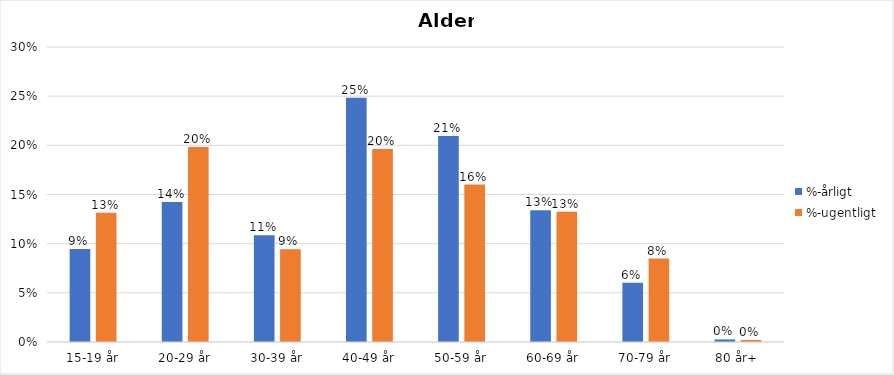
| Category | %-årligt | %-ugentligt |
|---|---|---|
| 15-19 år | 0.095 | 0.131 |
| 20-29 år | 0.142 | 0.198 |
| 30-39 år | 0.108 | 0.094 |
| 40-49 år | 0.248 | 0.196 |
| 50-59 år | 0.209 | 0.16 |
| 60-69 år | 0.134 | 0.133 |
| 70-79 år | 0.06 | 0.085 |
| 80 år+ | 0.003 | 0.002 |